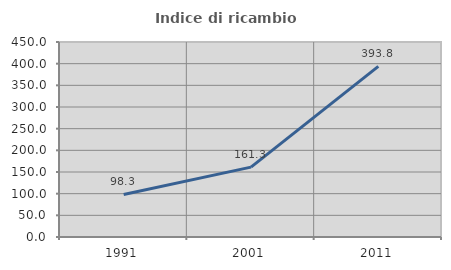
| Category | Indice di ricambio occupazionale  |
|---|---|
| 1991.0 | 98.276 |
| 2001.0 | 161.29 |
| 2011.0 | 393.75 |